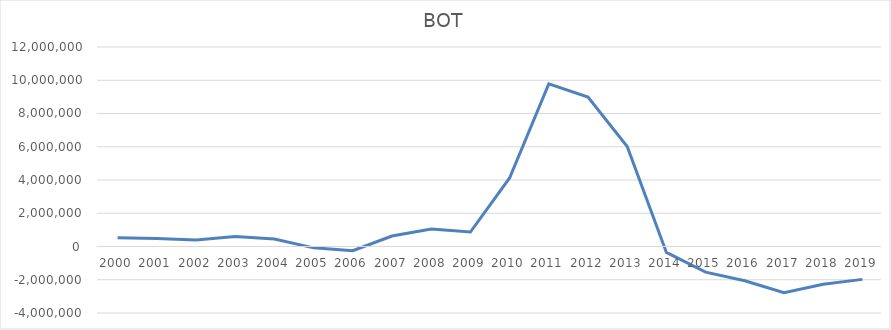
| Category | BOT |
|---|---|
| 2000.0 | 521629.2 |
| 2001.0 | 474666.8 |
| 2002.0 | 391641 |
| 2003.0 | 605788.4 |
| 2004.0 | 450627.84 |
| 2005.0 | -81154.58 |
| 2006.0 | -257347.4 |
| 2007.0 | 627900.01 |
| 2008.0 | 1046107.96 |
| 2009.0 | 869571.5 |
| 2010.0 | 4120755.04 |
| 2011.0 | 9784388.91 |
| 2012.0 | 8986692.8 |
| 2013.0 | 6009282.51 |
| 2014.0 | -356769.88 |
| 2015.0 | -1540007.91 |
| 2016.0 | -2063204.5 |
| 2017.0 | -2785193.78 |
| 2018.0 | -2275693.21 |
| 2019.0 | -1978070.65 |